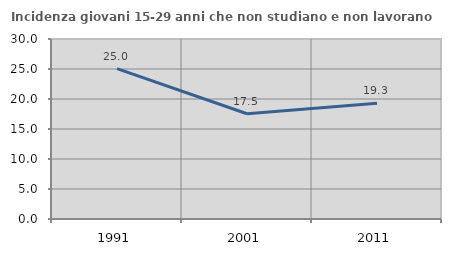
| Category | Incidenza giovani 15-29 anni che non studiano e non lavorano  |
|---|---|
| 1991.0 | 25.049 |
| 2001.0 | 17.541 |
| 2011.0 | 19.273 |